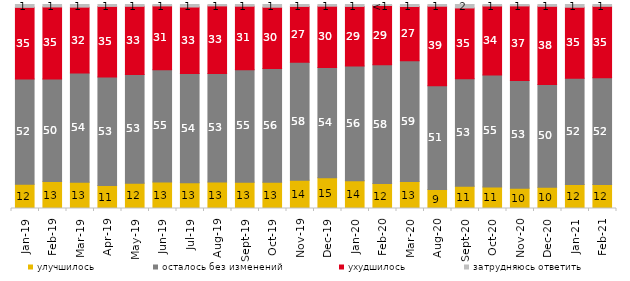
| Category | улучшилось | осталось без изменений | ухудшилось | затрудняюсь ответить |
|---|---|---|---|---|
| 2019-01-01 | 11.85 | 51.6 | 35.15 | 1.4 |
| 2019-02-01 | 13.2 | 50.3 | 35.3 | 1.2 |
| 2019-03-01 | 12.929 | 53.506 | 32.273 | 1.293 |
| 2019-04-01 | 11.238 | 53.168 | 34.653 | 0.941 |
| 2019-05-01 | 12.432 | 53.244 | 33.432 | 0.892 |
| 2019-06-01 | 13.017 | 54.963 | 31.322 | 0.698 |
| 2019-07-01 | 12.624 | 53.564 | 32.574 | 1.238 |
| 2019-08-01 | 12.937 | 53.197 | 33.167 | 0.699 |
| 2019-09-01 | 12.871 | 55.149 | 31.139 | 0.842 |
| 2019-10-01 | 12.921 | 55.693 | 30.05 | 1.337 |
| 2019-11-01 | 13.861 | 57.772 | 27.426 | 0.941 |
| 2019-12-01 | 15.099 | 53.96 | 30.099 | 0.842 |
| 2020-01-01 | 13.663 | 56.238 | 29.158 | 0.941 |
| 2020-02-01 | 12.228 | 58.218 | 29.059 | 0.495 |
| 2020-03-01 | 13.188 | 59.147 | 26.624 | 0.992 |
| 2020-08-01 | 9.285 | 50.943 | 38.928 | 0.844 |
| 2020-09-01 | 10.951 | 52.713 | 34.644 | 1.692 |
| 2020-10-01 | 10.563 | 54.858 | 33.832 | 0.747 |
| 2020-11-01 | 9.95 | 52.85 | 36.5 | 0.7 |
| 2020-12-01 | 10.362 | 50.372 | 38.374 | 0.892 |
| 2021-01-01 | 11.773 | 52.111 | 34.774 | 1.341 |
| 2021-02-01 | 11.762 | 52.357 | 34.988 | 0.893 |